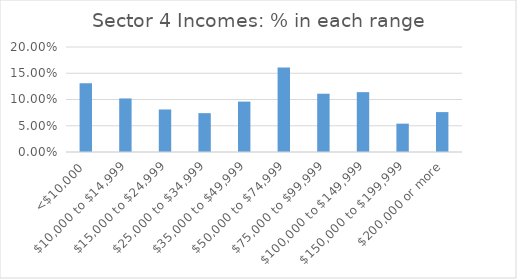
| Category | Series 0 |
|---|---|
| <$10,000 | 0.131 |
| $10,000 to $14,999 | 0.102 |
| $15,000 to $24,999 | 0.081 |
| $25,000 to $34,999 | 0.074 |
| $35,000 to $49,999 | 0.096 |
| $50,000 to $74,999 | 0.161 |
| $75,000 to $99,999 | 0.111 |
| $100,000 to $149,999 | 0.114 |
| $150,000 to $199,999 | 0.054 |
| $200,000 or more | 0.076 |